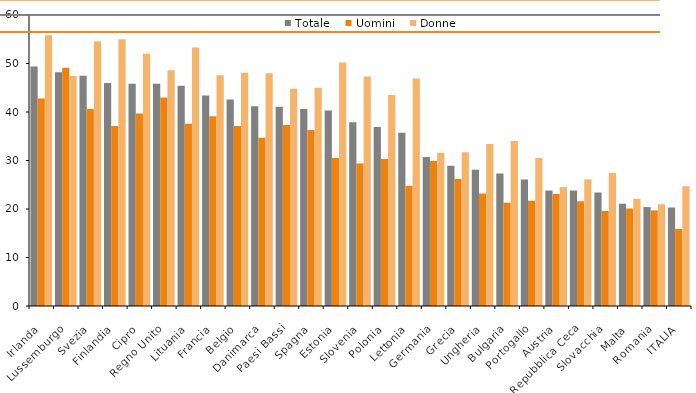
| Category | Totale | Uomini | Donne |
|---|---|---|---|
| Irlanda | 49.4 | 42.8 | 55.8 |
| Lussemburgo | 48.2 | 49.1 | 47.4 |
| Svezia | 47.5 | 40.6 | 54.6 |
| Finlandia | 46 | 37.1 | 55 |
| Cipro | 45.8 | 39.7 | 52 |
| Regno Unito | 45.8 | 43 | 48.6 |
| Lituania | 45.4 | 37.6 | 53.3 |
| Francia | 43.4 | 39.1 | 47.6 |
| Belgio | 42.6 | 37.1 | 48.1 |
| Danimarca | 41.2 | 34.7 | 48 |
| Paesi Bassi | 41.1 | 37.3 | 44.8 |
| Spagna | 40.6 | 36.3 | 45 |
| Estonia | 40.3 | 30.5 | 50.2 |
| Slovenia | 37.9 | 29.4 | 47.3 |
| Polonia | 36.9 | 30.3 | 43.5 |
| Lettonia | 35.7 | 24.8 | 46.9 |
| Germania | 30.7 | 29.9 | 31.6 |
| Grecia | 28.9 | 26.2 | 31.7 |
| Ungheria | 28.1 | 23.2 | 33.4 |
| Bulgaria | 27.3 | 21.3 | 34 |
| Portogallo | 26.1 | 21.7 | 30.5 |
| Austria | 23.8 | 23.1 | 24.5 |
| Repubblica Ceca | 23.8 | 21.6 | 26.1 |
| Slovacchia | 23.4 | 19.6 | 27.4 |
| Malta | 21.1 | 20.1 | 22.1 |
| Romania | 20.4 | 19.7 | 21 |
| ITALIA | 20.3 | 15.9 | 24.7 |